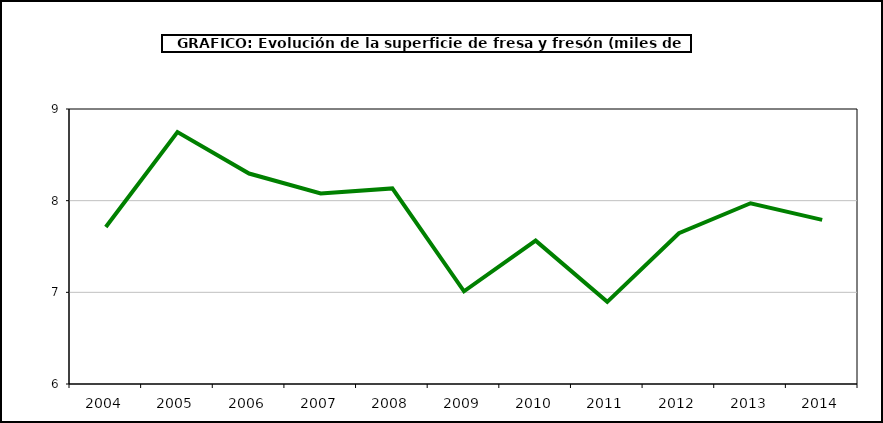
| Category | superficie |
|---|---|
| 2004.0 | 7.713 |
| 2005.0 | 8.748 |
| 2006.0 | 8.296 |
| 2007.0 | 8.078 |
| 2008.0 | 8.134 |
| 2009.0 | 7.011 |
| 2010.0 | 7.564 |
| 2011.0 | 6.896 |
| 2012.0 | 7.645 |
| 2013.0 | 7.972 |
| 2014.0 | 7.791 |